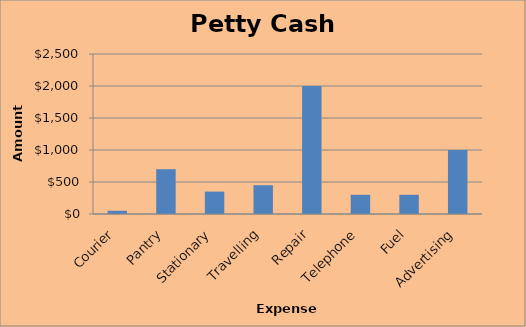
| Category | Series 0 |
|---|---|
| Courier | 50 |
| Pantry | 700 |
| Stationary | 350 |
| Travelling | 450 |
| Repair | 2000 |
| Telephone | 300 |
| Fuel | 300 |
| Advertising | 1000 |